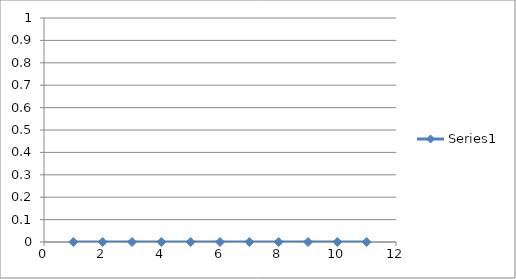
| Category | Series 0 |
|---|---|
| 0.0 | 0 |
| 0.4 | 24.768 |
| 0.8 | 39.936 |
| 1.2 | 47.04 |
| 1.6 | 47.616 |
| 2.0 | 43.2 |
| 2.4 | 35.328 |
| 2.8 | 25.536 |
| 3.2 | 15.36 |
| 3.6 | 6.336 |
| 4.0 | 0 |